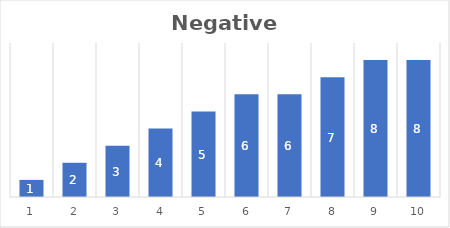
| Category | Series 0 |
|---|---|
| 0 | 1 |
| 1 | 2 |
| 2 | 3 |
| 3 | 4 |
| 4 | 5 |
| 5 | 6 |
| 6 | 6 |
| 7 | 7 |
| 8 | 8 |
| 9 | 8 |